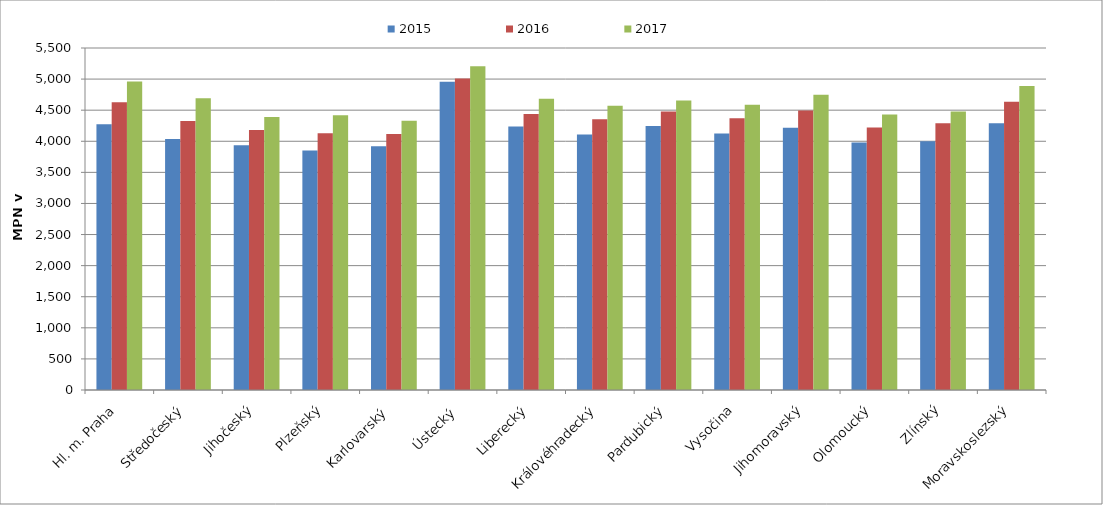
| Category | 2015 | 2016 | 2017 |
|---|---|---|---|
| Hl. m. Praha | 4271.749 | 4625.912 | 4961.604 |
| Středočeský | 4036.867 | 4326.702 | 4692.147 |
| Jihočeský | 3934.839 | 4182.825 | 4391.394 |
| Plzeňský | 3849.72 | 4130.136 | 4419.185 |
| Karlovarský  | 3918.902 | 4115.742 | 4330.476 |
| Ústecký   | 4955.317 | 5008 | 5208.195 |
| Liberecký | 4237.344 | 4439.596 | 4684.951 |
| Královéhradecký | 4108.131 | 4354.54 | 4572.107 |
| Pardubický | 4247.446 | 4477.211 | 4656.515 |
| Vysočina | 4124.562 | 4368.398 | 4586.781 |
| Jihomoravský | 4218.084 | 4493.154 | 4749.795 |
| Olomoucký | 3981.009 | 4219.941 | 4431.098 |
| Zlínský | 4001.473 | 4289.756 | 4480.271 |
| Moravskoslezský | 4289.487 | 4636.569 | 4889.336 |